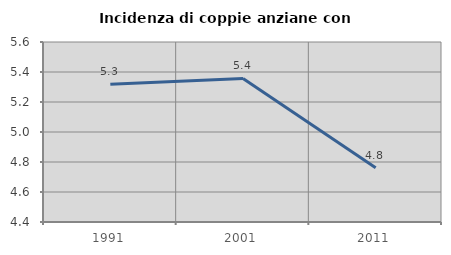
| Category | Incidenza di coppie anziane con figli |
|---|---|
| 1991.0 | 5.319 |
| 2001.0 | 5.357 |
| 2011.0 | 4.762 |